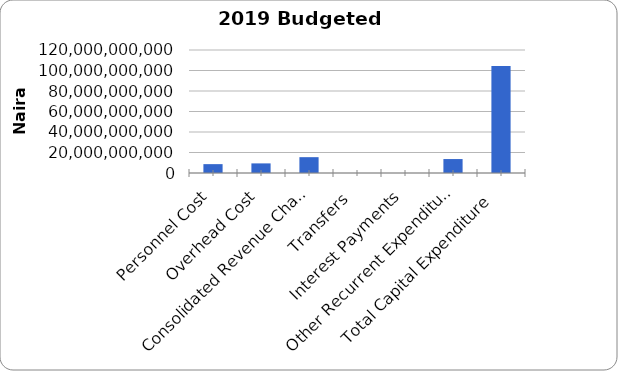
| Category | 2019 Budget Target  |
|---|---|
| Personnel Cost | 8649199049 |
| Overhead Cost | 9375902555 |
| Consolidated Revenue Charges  | 15445296933 |
| Transfers  | 0 |
| Interest Payments | 0 |
| Other Recurrent Expenditure  | 13606787883 |
| Total Capital Expenditure  | 104385049818 |